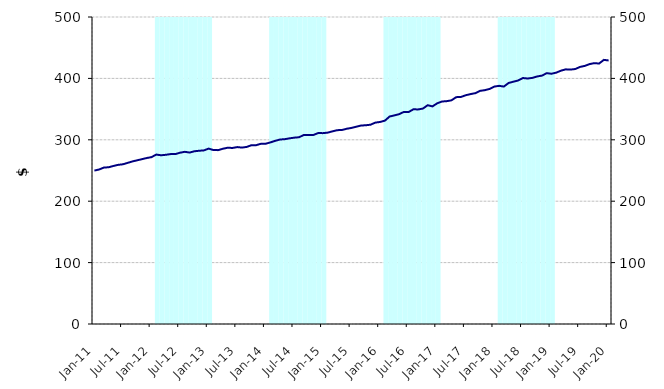
| Category | Series 1 |
|---|---|
| 0 | 0 |
| 1900-01-01 | 0 |
| 1900-01-02 | 0 |
| 1900-01-03 | 0 |
| 1900-01-04 | 0 |
| 1900-01-05 | 0 |
| 1900-01-06 | 0 |
| 1900-01-07 | 0 |
| 1900-01-08 | 0 |
| 1900-01-09 | 0 |
| 1900-01-10 | 0 |
| 1900-01-11 | 0 |
| 1900-01-12 | 0 |
| 1900-01-13 | 500000000 |
| 1900-01-14 | 500000000 |
| 1900-01-15 | 500000000 |
| 1900-01-16 | 500000000 |
| 1900-01-17 | 500000000 |
| 1900-01-18 | 500000000 |
| 1900-01-19 | 500000000 |
| 1900-01-20 | 500000000 |
| 1900-01-21 | 500000000 |
| 1900-01-22 | 500000000 |
| 1900-01-23 | 500000000 |
| 1900-01-24 | 500000000 |
| 1900-01-25 | 0 |
| 1900-01-26 | 0 |
| 1900-01-27 | 0 |
| 1900-01-28 | 0 |
| 1900-01-29 | 0 |
| 1900-01-30 | 0 |
| 1900-01-31 | 0 |
| 1900-02-01 | 0 |
| 1900-02-02 | 0 |
| 1900-02-03 | 0 |
| 1900-02-04 | 0 |
| 1900-02-05 | 0 |
| 1900-02-06 | 500000000 |
| 1900-02-07 | 500000000 |
| 1900-02-08 | 500000000 |
| 1900-02-09 | 500000000 |
| 1900-02-10 | 500000000 |
| 1900-02-11 | 500000000 |
| 1900-02-12 | 500000000 |
| 1900-02-13 | 500000000 |
| 1900-02-14 | 500000000 |
| 1900-02-15 | 500000000 |
| 1900-02-16 | 500000000 |
| 1900-02-17 | 500000000 |
| 1900-02-18 | 0 |
| 1900-02-19 | 0 |
| 1900-02-20 | 0 |
| 1900-02-21 | 0 |
| 1900-02-22 | 0 |
| 1900-02-23 | 0 |
| 1900-02-24 | 0 |
| 1900-02-25 | 0 |
| 1900-02-26 | 0 |
| 1900-02-27 | 0 |
| 1900-02-28 | 0 |
| 1900-02-28 | 0 |
| 1900-03-01 | 500000000 |
| 1900-03-02 | 500000000 |
| 1900-03-03 | 500000000 |
| 1900-03-04 | 500000000 |
| 1900-03-05 | 500000000 |
| 1900-03-06 | 500000000 |
| 1900-03-07 | 500000000 |
| 1900-03-08 | 500000000 |
| 1900-03-09 | 500000000 |
| 1900-03-10 | 500000000 |
| 1900-03-11 | 500000000 |
| 1900-03-12 | 500000000 |
| 1900-03-13 | 0 |
| 1900-03-14 | 0 |
| 1900-03-15 | 0 |
| 1900-03-16 | 0 |
| 1900-03-17 | 0 |
| 1900-03-18 | 0 |
| 1900-03-19 | 0 |
| 1900-03-20 | 0 |
| 1900-03-21 | 0 |
| 1900-03-22 | 0 |
| 1900-03-23 | 0 |
| 1900-03-24 | 0 |
| 1900-03-25 | 500000000 |
| 1900-03-26 | 500000000 |
| 1900-03-27 | 500000000 |
| 1900-03-28 | 500000000 |
| 1900-03-29 | 500000000 |
| 1900-03-30 | 500000000 |
| 1900-03-31 | 500000000 |
| 1900-04-01 | 500000000 |
| 1900-04-02 | 500000000 |
| 1900-04-03 | 500000000 |
| 1900-04-04 | 500000000 |
| 1900-04-05 | 500000000 |
| 1900-04-06 | 0 |
| 1900-04-07 | 0 |
| 1900-04-08 | 0 |
| 1900-04-09 | 0 |
| 1900-04-10 | 0 |
| 1900-04-11 | 0 |
| 1900-04-12 | 0 |
| 1900-04-13 | 0 |
| 1900-04-14 | 0 |
| 1900-04-15 | 0 |
| 1900-04-16 | 0 |
| 1900-04-17 | 0 |